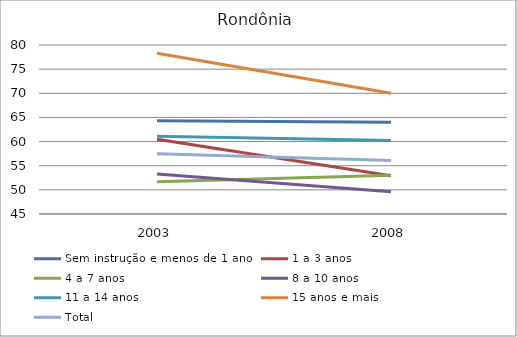
| Category | Sem instrução e menos de 1 ano | 1 a 3 anos | 4 a 7 anos | 8 a 10 anos | 11 a 14 anos | 15 anos e mais | Total |
|---|---|---|---|---|---|---|---|
| 2003.0 | 64.3 | 60.5 | 51.7 | 53.3 | 61.1 | 78.3 | 57.5 |
| 2008.0 | 64 | 52.9 | 53 | 49.6 | 60.2 | 70 | 56.1 |